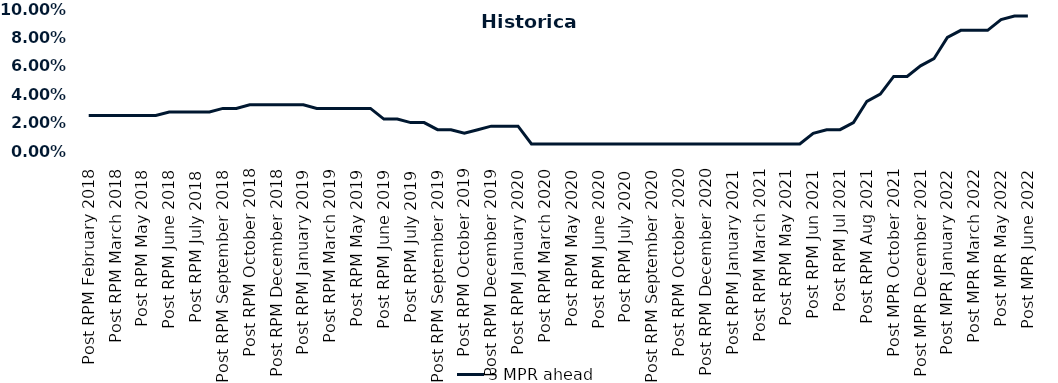
| Category | 3 MPR ahead |
|---|---|
| Post RPM February 2018 | 0.025 |
| Pre RPM March 2018 | 0.025 |
| Post RPM March 2018 | 0.025 |
| Pre RPM May 2018 | 0.025 |
| Post RPM May 2018 | 0.025 |
| Pre RPM June 2018 | 0.025 |
| Post RPM June 2018 | 0.028 |
| Pre RPM July 2018 | 0.028 |
| Post RPM July 2018 | 0.028 |
| Pre RPM September 2018 | 0.028 |
| Post RPM September 2018 | 0.03 |
| Pre RPM October 2018 | 0.03 |
| Post RPM October 2018 | 0.032 |
| Pre RPM December 2018 | 0.032 |
| Post RPM December 2018 | 0.032 |
| Pre RPM January 2019 | 0.032 |
| Post RPM January 2019 | 0.032 |
| Pre RPM March 2019 | 0.03 |
| Post RPM March 2019 | 0.03 |
| Pre RPM May 2019 | 0.03 |
| Post RPM May 2019 | 0.03 |
| Pre RPM June 2019 | 0.03 |
| Post RPM June 2019 | 0.022 |
| Pre RPM July 2019 | 0.022 |
| Post RPM July 2019 | 0.02 |
| Pre RPM September 2019 | 0.02 |
| Post RPM September 2019 | 0.015 |
| Pre RPM October 2019 | 0.015 |
| Post RPM October 2019 | 0.012 |
| Pre RPM December 2019 | 0.015 |
| Post RPM December 2019 | 0.018 |
| Pre RPM January 2020 | 0.018 |
| Post RPM January 2020 | 0.018 |
| Pre RPM March 2020 | 0.005 |
| Post RPM March 2020 | 0.005 |
| Pre RPM May 2020 | 0.005 |
| Post RPM May 2020 | 0.005 |
| Pre RPM June 2020 | 0.005 |
| Post RPM June 2020 | 0.005 |
| Pre RPM July 2020 | 0.005 |
| Post RPM July 2020 | 0.005 |
| Pre RPM September 2020 | 0.005 |
| Post RPM September 2020 | 0.005 |
| Pre RPM October 2020 | 0.005 |
| Post RPM October 2020 | 0.005 |
| Pre RPM December 2020 | 0.005 |
|  Post RPM December 2020 | 0.005 |
| Pre RPM January 2021 | 0.005 |
| Post RPM January 2021 | 0.005 |
|  Pre RPM March 2021 | 0.005 |
|  Post RPM March 2021 | 0.005 |
|  Pre RPM May 2021 | 0.005 |
|  Post RPM May 2021 | 0.005 |
|  Pre RPM Jun 2021 | 0.005 |
|   Post RPM Jun 2021 | 0.012 |
| Pre RPM Jul 2021 | 0.015 |
|  Post RPM Jul 2021 | 0.015 |
| Pre RPM Aug 2021 | 0.02 |
|  Post RPM Aug 2021 | 0.035 |
| Pre MPR October 2021 | 0.04 |
| Post MPR October 2021 | 0.052 |
| Pre MPR December 2021 | 0.052 |
| Post MPR December 2021 | 0.06 |
| Pre MPR January 2022 | 0.065 |
| Post MPR January 2022 | 0.08 |
| Pre MPR March 2022 | 0.085 |
| Post MPR March 2022 | 0.085 |
| Pre MPR May 2022 | 0.085 |
| Post MPR May 2022 | 0.092 |
| Pre MPR June 2022 | 0.095 |
| Post MPR June 2022 | 0.095 |